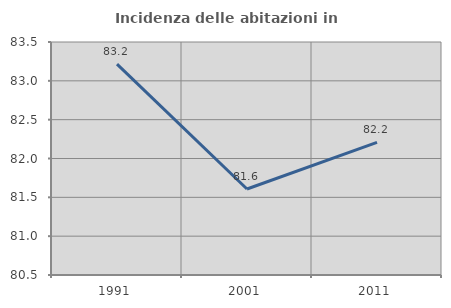
| Category | Incidenza delle abitazioni in proprietà  |
|---|---|
| 1991.0 | 83.214 |
| 2001.0 | 81.607 |
| 2011.0 | 82.208 |